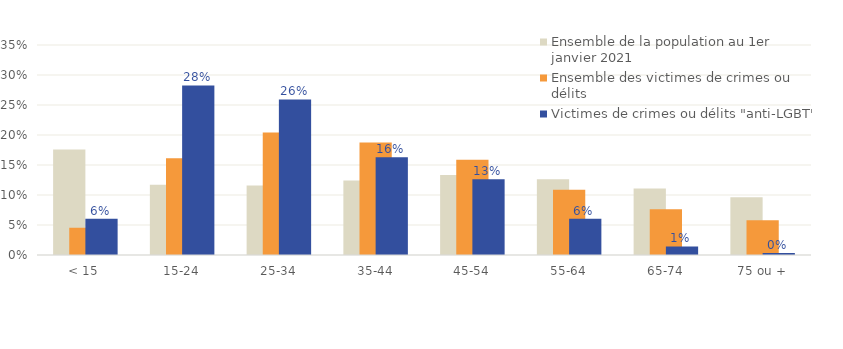
| Category | Ensemble de la population au 1er janvier 2021 | Ensemble des victimes de crimes ou délits | Victimes de crimes ou délits "anti-LGBT" |
|---|---|---|---|
| < 15 | 0.176 | 0.046 | 0.06 |
| 15-24 | 0.117 | 0.161 | 0.283 |
| 25-34 | 0.116 | 0.204 | 0.259 |
| 35-44 | 0.124 | 0.188 | 0.163 |
| 45-54 | 0.133 | 0.159 | 0.126 |
| 55-64 | 0.126 | 0.109 | 0.06 |
| 65-74 | 0.111 | 0.076 | 0.014 |
| 75 ou + | 0.096 | 0.058 | 0.003 |